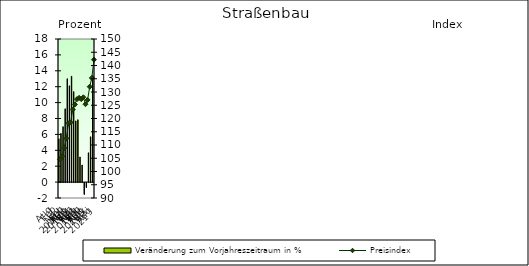
| Category | Veränderung zum Vorjahreszeitraum in % |
|---|---|
| 0 | 5.444 |
| 1 | 6.124 |
| 2 | 6.974 |
| 3 | 9.223 |
| 4 | 13.002 |
| 5 | 12.11 |
| 6 | 13.315 |
| 7 | 11.378 |
| 8 | 7.699 |
| 9 | 7.848 |
| 10 | 3.16 |
| 11 | 2.155 |
| 12 | -1.493 |
| 13 | -0.626 |
| 14 | 3.692 |
| 15 | 5.703 |
| 16 | 13.397 |